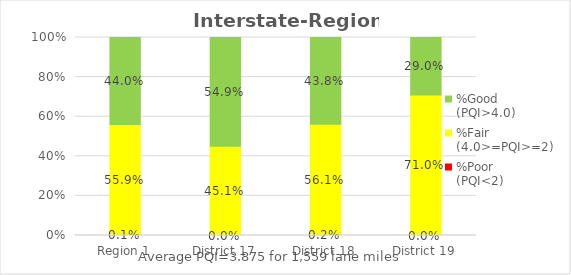
| Category | %Poor
(PQI<2) | %Fair
(4.0>=PQI>=2) | %Good
(PQI>4.0) |
|---|---|---|---|
| Region 1 | 0.001 | 0.559 | 0.44 |
| District 17 | 0 | 0.451 | 0.549 |
| District 18 | 0.002 | 0.561 | 0.438 |
| District 19 | 0 | 0.71 | 0.29 |